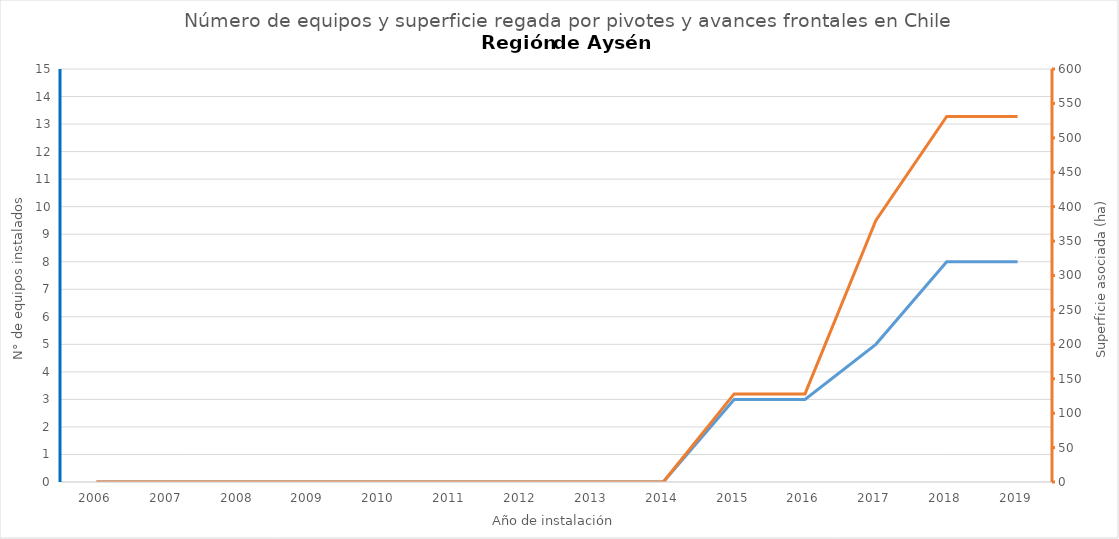
| Category | N° |
|---|---|
| 2006.0 | 0 |
| 2007.0 | 0 |
| 2008.0 | 0 |
| 2009.0 | 0 |
| 2010.0 | 0 |
| 2011.0 | 0 |
| 2012.0 | 0 |
| 2013.0 | 0 |
| 2014.0 | 0 |
| 2015.0 | 3 |
| 2016.0 | 3 |
| 2017.0 | 5 |
| 2018.0 | 8 |
| 2019.0 | 8 |